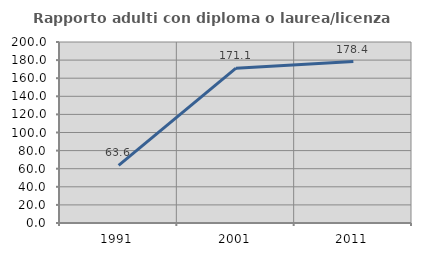
| Category | Rapporto adulti con diploma o laurea/licenza media  |
|---|---|
| 1991.0 | 63.636 |
| 2001.0 | 171.053 |
| 2011.0 | 178.378 |